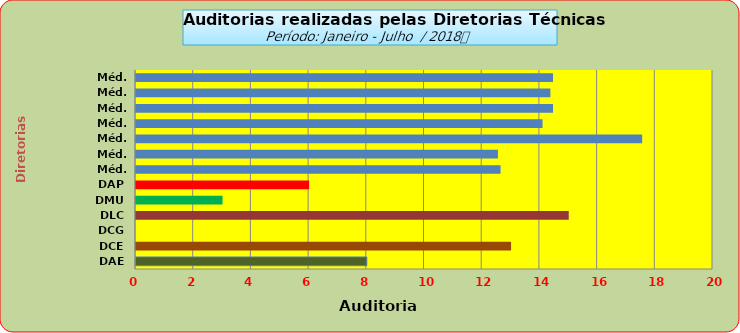
| Category | Series 0 |
|---|---|
| DAE | 8 |
| DCE | 13 |
| DCG | 0 |
| DLC | 15 |
| DMU | 3 |
| DAP | 6 |
| Méd. 2011 | 12.636 |
| Méd. 2012 | 12.545 |
| Méd. 2013 | 17.545 |
| Méd. 2014 | 14.091 |
| Méd. 2015 | 14.455 |
| Méd. 2016 | 14.364 |
| Méd. 2017 | 14.455 |